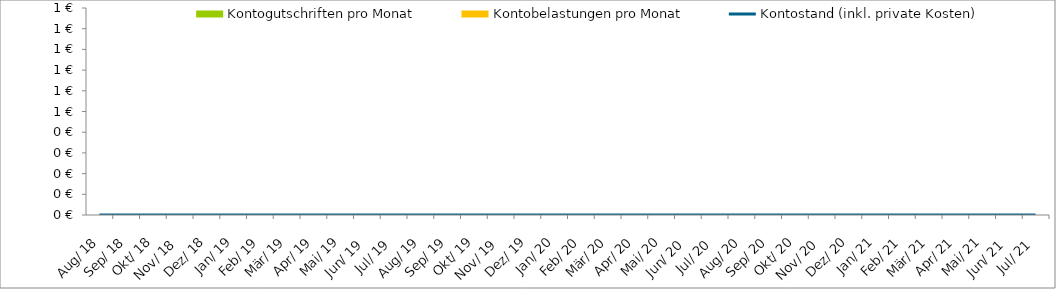
| Category | Kontogutschriften pro Monat | Kontobelastungen pro Monat |
|---|---|---|
| 2018-08-01 | 0 | 0 |
| 2018-09-01 | 0 | 0 |
| 2018-10-01 | 0 | 0 |
| 2018-11-01 | 0 | 0 |
| 2018-12-01 | 0 | 0 |
| 2019-01-01 | 0 | 0 |
| 2019-02-01 | 0 | 0 |
| 2019-03-01 | 0 | 0 |
| 2019-04-01 | 0 | 0 |
| 2019-05-01 | 0 | 0 |
| 2019-06-01 | 0 | 0 |
| 2019-07-01 | 0 | 0 |
| 2019-08-01 | 0 | 0 |
| 2019-09-01 | 0 | 0 |
| 2019-10-01 | 0 | 0 |
| 2019-11-01 | 0 | 0 |
| 2019-12-01 | 0 | 0 |
| 2020-01-01 | 0 | 0 |
| 2020-02-01 | 0 | 0 |
| 2020-03-01 | 0 | 0 |
| 2020-04-01 | 0 | 0 |
| 2020-05-01 | 0 | 0 |
| 2020-06-01 | 0 | 0 |
| 2020-07-01 | 0 | 0 |
| 2020-08-01 | 0 | 0 |
| 2020-09-01 | 0 | 0 |
| 2020-10-01 | 0 | 0 |
| 2020-11-01 | 0 | 0 |
| 2020-12-01 | 0 | 0 |
| 2021-01-01 | 0 | 0 |
| 2021-02-01 | 0 | 0 |
| 2021-03-01 | 0 | 0 |
| 2021-04-01 | 0 | 0 |
| 2021-05-01 | 0 | 0 |
| 2021-06-01 | 0 | 0 |
| 2021-07-01 | 0 | 0 |